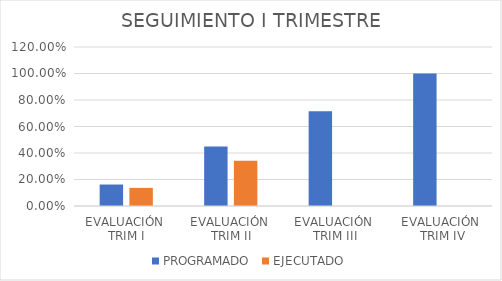
| Category | PROGRAMADO | EJECUTADO |
|---|---|---|
| EVALUACIÓN 
TRIM I | 0.162 | 0.137 |
| EVALUACIÓN 
TRIM II | 0.448 | 0.341 |
| EVALUACIÓN 
TRIM III | 0.715 | 0 |
| EVALUACIÓN
 TRIM IV | 1 | 0 |